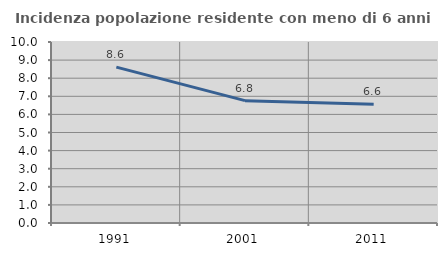
| Category | Incidenza popolazione residente con meno di 6 anni |
|---|---|
| 1991.0 | 8.614 |
| 2001.0 | 6.761 |
| 2011.0 | 6.555 |